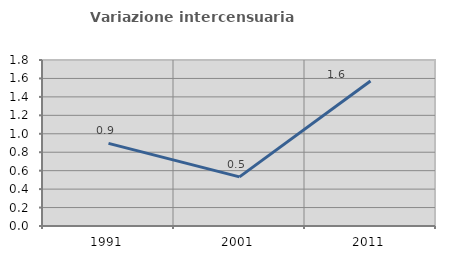
| Category | Variazione intercensuaria annua |
|---|---|
| 1991.0 | 0.896 |
| 2001.0 | 0.533 |
| 2011.0 | 1.572 |